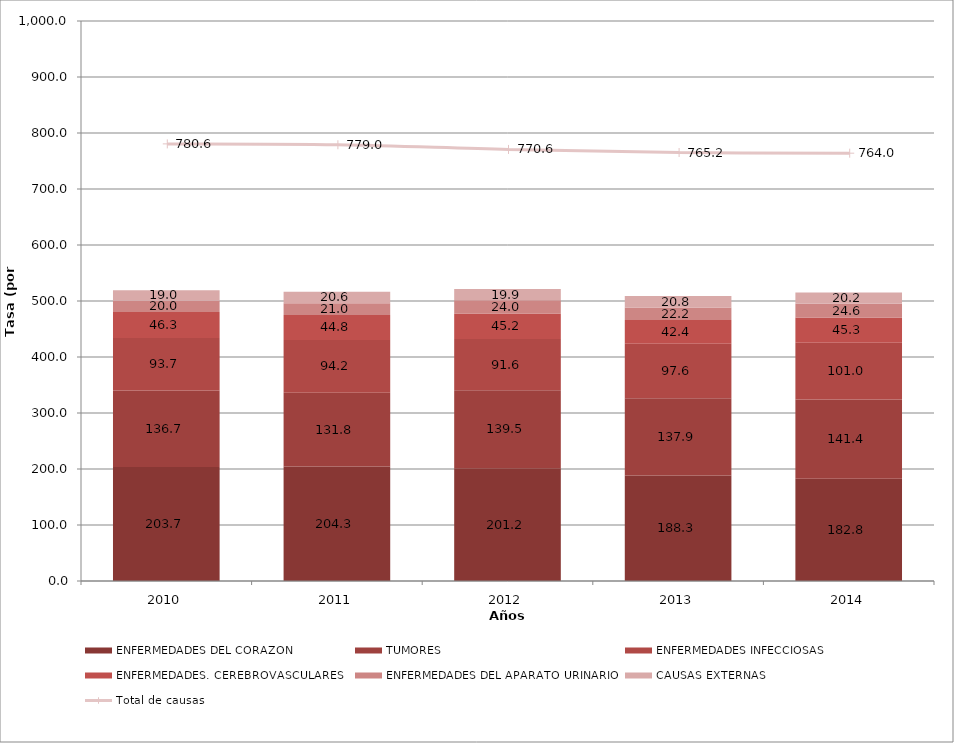
| Category | ENFERMEDADES DEL CORAZON | TUMORES | ENFERMEDADES INFECCIOSAS | ENFERMEDADES. CEREBROVASCULARES | ENFERMEDADES DEL APARATO URINARIO | CAUSAS EXTERNAS |
|---|---|---|---|---|---|---|
| 2010.0 | 203.699 | 136.682 | 93.738 | 46.266 | 19.967 | 19.034 |
| 2011.0 | 204.338 | 131.832 | 94.232 | 44.792 | 20.964 | 20.57 |
| 2012.0 | 201.229 | 139.493 | 91.577 | 45.169 | 23.958 | 19.898 |
| 2013.0 | 188.263 | 137.901 | 97.623 | 42.357 | 22.224 | 20.758 |
| 2014.0 | 182.754 | 141.441 | 101.031 | 45.344 | 24.562 | 20.199 |